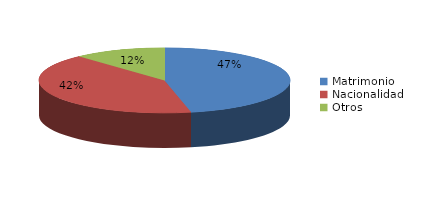
| Category | Series 0 |
|---|---|
| Matrimonio | 448 |
| Nacionalidad | 399 |
| Otros | 114 |